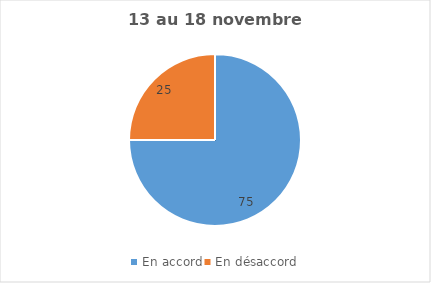
| Category | Series 0 |
|---|---|
| En accord | 75 |
| En désaccord | 25 |